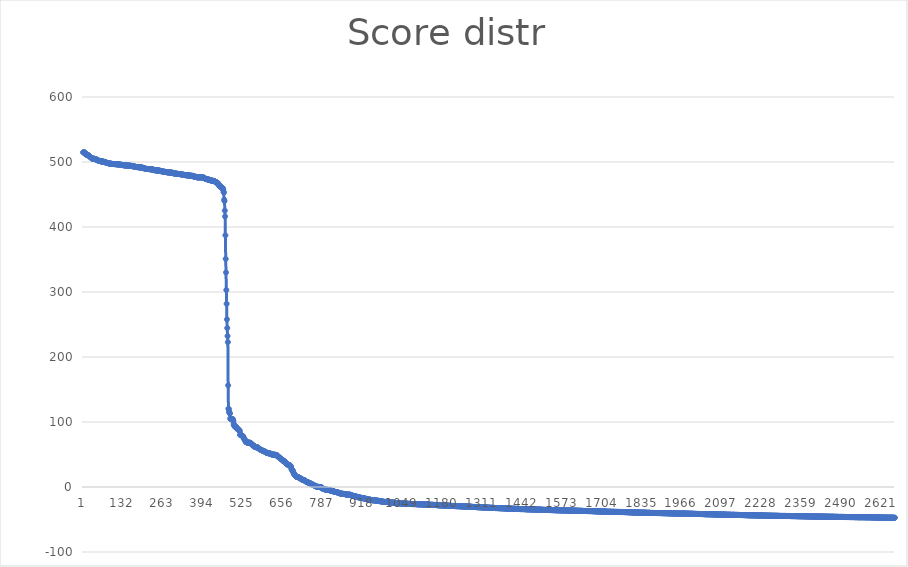
| Category | Series 0 |
|---|---|
| 0 | 514.8 |
| 1 | 514.8 |
| 2 | 514.8 |
| 3 | 514.7 |
| 4 | 514.7 |
| 5 | 514.7 |
| 6 | 512.7 |
| 7 | 512.7 |
| 8 | 512.7 |
| 9 | 512.7 |
| 10 | 512.7 |
| 11 | 511.2 |
| 12 | 510.8 |
| 13 | 510.6 |
| 14 | 510.6 |
| 15 | 510.6 |
| 16 | 510.6 |
| 17 | 510.6 |
| 18 | 510 |
| 19 | 509.2 |
| 20 | 509.1 |
| 21 | 508.8 |
| 22 | 508.6 |
| 23 | 507.6 |
| 24 | 507.4 |
| 25 | 506.9 |
| 26 | 506.4 |
| 27 | 506 |
| 28 | 505.8 |
| 29 | 505.6 |
| 30 | 505.2 |
| 31 | 505.2 |
| 32 | 505.2 |
| 33 | 505.2 |
| 34 | 505.1 |
| 35 | 505.1 |
| 36 | 505 |
| 37 | 504.5 |
| 38 | 504.5 |
| 39 | 504.5 |
| 40 | 504.5 |
| 41 | 504.4 |
| 42 | 504.3 |
| 43 | 503.9 |
| 44 | 503.6 |
| 45 | 503.3 |
| 46 | 502.8 |
| 47 | 502.8 |
| 48 | 502.8 |
| 49 | 502.2 |
| 50 | 502.1 |
| 51 | 502.1 |
| 52 | 502 |
| 53 | 501.7 |
| 54 | 501.5 |
| 55 | 501.5 |
| 56 | 501.5 |
| 57 | 501.1 |
| 58 | 501 |
| 59 | 501 |
| 60 | 500.9 |
| 61 | 500.9 |
| 62 | 500.8 |
| 63 | 500.7 |
| 64 | 500.6 |
| 65 | 500.6 |
| 66 | 500.4 |
| 67 | 500.4 |
| 68 | 500.4 |
| 69 | 500.1 |
| 70 | 499.9 |
| 71 | 499.9 |
| 72 | 499.5 |
| 73 | 499.5 |
| 74 | 499.4 |
| 75 | 499.3 |
| 76 | 499.1 |
| 77 | 498.8 |
| 78 | 498.6 |
| 79 | 498.4 |
| 80 | 498.4 |
| 81 | 498.3 |
| 82 | 498.3 |
| 83 | 498 |
| 84 | 497.9 |
| 85 | 497.8 |
| 86 | 497.8 |
| 87 | 497.4 |
| 88 | 497.4 |
| 89 | 497.3 |
| 90 | 497.3 |
| 91 | 497.3 |
| 92 | 497.3 |
| 93 | 497.2 |
| 94 | 497.2 |
| 95 | 497 |
| 96 | 496.9 |
| 97 | 496.9 |
| 98 | 496.9 |
| 99 | 496.9 |
| 100 | 496.9 |
| 101 | 496.9 |
| 102 | 496.9 |
| 103 | 496.8 |
| 104 | 496.7 |
| 105 | 496.7 |
| 106 | 496.7 |
| 107 | 496.7 |
| 108 | 496.6 |
| 109 | 496.5 |
| 110 | 496.5 |
| 111 | 496.5 |
| 112 | 496.4 |
| 113 | 496.4 |
| 114 | 496.4 |
| 115 | 496.4 |
| 116 | 496.4 |
| 117 | 496.4 |
| 118 | 496.3 |
| 119 | 496.2 |
| 120 | 496.1 |
| 121 | 495.9 |
| 122 | 495.8 |
| 123 | 495.8 |
| 124 | 495.8 |
| 125 | 495.6 |
| 126 | 495.6 |
| 127 | 495.6 |
| 128 | 495.4 |
| 129 | 495.3 |
| 130 | 495.2 |
| 131 | 495.1 |
| 132 | 495.1 |
| 133 | 495.1 |
| 134 | 495 |
| 135 | 494.9 |
| 136 | 494.8 |
| 137 | 494.8 |
| 138 | 494.8 |
| 139 | 494.7 |
| 140 | 494.7 |
| 141 | 494.7 |
| 142 | 494.6 |
| 143 | 494.6 |
| 144 | 494.6 |
| 145 | 494.5 |
| 146 | 494.5 |
| 147 | 494.5 |
| 148 | 494.4 |
| 149 | 494.4 |
| 150 | 494.3 |
| 151 | 494.3 |
| 152 | 494.2 |
| 153 | 494.2 |
| 154 | 494.2 |
| 155 | 494.2 |
| 156 | 494.2 |
| 157 | 494.1 |
| 158 | 494.1 |
| 159 | 493.7 |
| 160 | 493.7 |
| 161 | 493.6 |
| 162 | 493.5 |
| 163 | 493.5 |
| 164 | 493.4 |
| 165 | 493.4 |
| 166 | 493.3 |
| 167 | 493 |
| 168 | 492.8 |
| 169 | 492.8 |
| 170 | 492.7 |
| 171 | 492.6 |
| 172 | 492.6 |
| 173 | 492.5 |
| 174 | 492.3 |
| 175 | 492.3 |
| 176 | 492.3 |
| 177 | 492.2 |
| 178 | 492.1 |
| 179 | 492.1 |
| 180 | 492 |
| 181 | 492 |
| 182 | 492 |
| 183 | 492 |
| 184 | 491.8 |
| 185 | 491.8 |
| 186 | 491.7 |
| 187 | 491.6 |
| 188 | 491.6 |
| 189 | 491.5 |
| 190 | 491.5 |
| 191 | 491.4 |
| 192 | 491.4 |
| 193 | 491.3 |
| 194 | 491.2 |
| 195 | 491.2 |
| 196 | 491.1 |
| 197 | 490.8 |
| 198 | 490.6 |
| 199 | 490.4 |
| 200 | 490.3 |
| 201 | 490.2 |
| 202 | 490.1 |
| 203 | 489.9 |
| 204 | 489.6 |
| 205 | 489.6 |
| 206 | 489.6 |
| 207 | 489.3 |
| 208 | 489.2 |
| 209 | 489.2 |
| 210 | 489.2 |
| 211 | 489.2 |
| 212 | 489.2 |
| 213 | 489.2 |
| 214 | 489.2 |
| 215 | 489.1 |
| 216 | 489.1 |
| 217 | 489 |
| 218 | 488.9 |
| 219 | 488.9 |
| 220 | 488.9 |
| 221 | 488.9 |
| 222 | 488.9 |
| 223 | 488.8 |
| 224 | 488.5 |
| 225 | 488.5 |
| 226 | 488.5 |
| 227 | 488.5 |
| 228 | 488.4 |
| 229 | 488.3 |
| 230 | 488 |
| 231 | 487.9 |
| 232 | 487.9 |
| 233 | 487.9 |
| 234 | 487.5 |
| 235 | 487.3 |
| 236 | 487.2 |
| 237 | 487.2 |
| 238 | 487.2 |
| 239 | 487.2 |
| 240 | 487.1 |
| 241 | 487 |
| 242 | 486.9 |
| 243 | 486.9 |
| 244 | 486.9 |
| 245 | 486.9 |
| 246 | 486.9 |
| 247 | 486.9 |
| 248 | 486.8 |
| 249 | 486.8 |
| 250 | 486.8 |
| 251 | 486.6 |
| 252 | 486.4 |
| 253 | 486 |
| 254 | 486 |
| 255 | 486 |
| 256 | 485.9 |
| 257 | 485.9 |
| 258 | 485.9 |
| 259 | 485.7 |
| 260 | 485.4 |
| 261 | 485.4 |
| 262 | 485.2 |
| 263 | 485.1 |
| 264 | 485.1 |
| 265 | 485 |
| 266 | 484.9 |
| 267 | 484.8 |
| 268 | 484.8 |
| 269 | 484.8 |
| 270 | 484.8 |
| 271 | 484.5 |
| 272 | 484.5 |
| 273 | 484.5 |
| 274 | 484.5 |
| 275 | 484.5 |
| 276 | 484 |
| 277 | 484 |
| 278 | 483.9 |
| 279 | 483.9 |
| 280 | 483.9 |
| 281 | 483.9 |
| 282 | 483.9 |
| 283 | 483.9 |
| 284 | 483.9 |
| 285 | 483.8 |
| 286 | 483.7 |
| 287 | 483.7 |
| 288 | 483.7 |
| 289 | 483.7 |
| 290 | 483.6 |
| 291 | 483.5 |
| 292 | 483.3 |
| 293 | 483.2 |
| 294 | 482.8 |
| 295 | 482.8 |
| 296 | 482.7 |
| 297 | 482.7 |
| 298 | 482.6 |
| 299 | 482.3 |
| 300 | 482.3 |
| 301 | 482.3 |
| 302 | 482.3 |
| 303 | 482.1 |
| 304 | 482.1 |
| 305 | 482.1 |
| 306 | 482 |
| 307 | 482 |
| 308 | 481.8 |
| 309 | 481.6 |
| 310 | 481.6 |
| 311 | 481.6 |
| 312 | 481.5 |
| 313 | 481.5 |
| 314 | 481.5 |
| 315 | 481.5 |
| 316 | 481.5 |
| 317 | 481.4 |
| 318 | 481.3 |
| 319 | 481.3 |
| 320 | 481.1 |
| 321 | 481 |
| 322 | 481 |
| 323 | 480.7 |
| 324 | 480.7 |
| 325 | 480.6 |
| 326 | 480.5 |
| 327 | 480.5 |
| 328 | 480.5 |
| 329 | 480.5 |
| 330 | 480.1 |
| 331 | 480 |
| 332 | 480 |
| 333 | 480 |
| 334 | 479.8 |
| 335 | 479.8 |
| 336 | 479.8 |
| 337 | 479.7 |
| 338 | 479.5 |
| 339 | 479.5 |
| 340 | 479.5 |
| 341 | 479.5 |
| 342 | 479.5 |
| 343 | 479.5 |
| 344 | 479.5 |
| 345 | 479.5 |
| 346 | 479.5 |
| 347 | 479.5 |
| 348 | 479.2 |
| 349 | 479.1 |
| 350 | 479 |
| 351 | 478.9 |
| 352 | 478.8 |
| 353 | 478.8 |
| 354 | 478.8 |
| 355 | 478.7 |
| 356 | 478.7 |
| 357 | 478.7 |
| 358 | 478.7 |
| 359 | 478.7 |
| 360 | 478.6 |
| 361 | 477.9 |
| 362 | 477.8 |
| 363 | 477.8 |
| 364 | 477.5 |
| 365 | 477.4 |
| 366 | 477.2 |
| 367 | 477.2 |
| 368 | 477.2 |
| 369 | 477.2 |
| 370 | 477.2 |
| 371 | 477.1 |
| 372 | 477 |
| 373 | 476.4 |
| 374 | 476.4 |
| 375 | 476.4 |
| 376 | 476.4 |
| 377 | 476.4 |
| 378 | 476.4 |
| 379 | 476.4 |
| 380 | 476.4 |
| 381 | 476.4 |
| 382 | 476.4 |
| 383 | 476.4 |
| 384 | 476.4 |
| 385 | 476.4 |
| 386 | 476.4 |
| 387 | 476.4 |
| 388 | 476.4 |
| 389 | 476.4 |
| 390 | 476.1 |
| 391 | 476.1 |
| 392 | 476.1 |
| 393 | 476.1 |
| 394 | 475.9 |
| 395 | 475.9 |
| 396 | 475.7 |
| 397 | 475.7 |
| 398 | 475.2 |
| 399 | 474.5 |
| 400 | 474.4 |
| 401 | 474.1 |
| 402 | 473.7 |
| 403 | 473.7 |
| 404 | 473.6 |
| 405 | 473.6 |
| 406 | 473.6 |
| 407 | 473.5 |
| 408 | 473.5 |
| 409 | 473 |
| 410 | 473 |
| 411 | 472.7 |
| 412 | 472.6 |
| 413 | 472.6 |
| 414 | 472.6 |
| 415 | 472.5 |
| 416 | 472.1 |
| 417 | 472 |
| 418 | 471.6 |
| 419 | 471.5 |
| 420 | 471.4 |
| 421 | 471.4 |
| 422 | 471.2 |
| 423 | 471.2 |
| 424 | 471.1 |
| 425 | 471 |
| 426 | 471 |
| 427 | 470.9 |
| 428 | 470.9 |
| 429 | 470.6 |
| 430 | 470.4 |
| 431 | 470 |
| 432 | 469.9 |
| 433 | 469.4 |
| 434 | 469.4 |
| 435 | 469.1 |
| 436 | 468.7 |
| 437 | 468.5 |
| 438 | 468.4 |
| 439 | 468.1 |
| 440 | 467.8 |
| 441 | 467.8 |
| 442 | 466 |
| 443 | 465.7 |
| 444 | 465.3 |
| 445 | 464.9 |
| 446 | 463.3 |
| 447 | 462.5 |
| 448 | 462.5 |
| 449 | 462.5 |
| 450 | 462.3 |
| 451 | 462.2 |
| 452 | 462 |
| 453 | 461.1 |
| 454 | 460.2 |
| 455 | 460.1 |
| 456 | 459.9 |
| 457 | 459.9 |
| 458 | 459.3 |
| 459 | 457.1 |
| 460 | 453.8 |
| 461 | 453 |
| 462 | 442.1 |
| 463 | 439.8 |
| 464 | 425.2 |
| 465 | 416.2 |
| 466 | 387.2 |
| 467 | 350.9 |
| 468 | 330.1 |
| 469 | 303 |
| 470 | 281.9 |
| 471 | 257.9 |
| 472 | 244.6 |
| 473 | 232.2 |
| 474 | 222.9 |
| 475 | 156.4 |
| 476 | 120.6 |
| 477 | 120.1 |
| 478 | 116.5 |
| 479 | 114.1 |
| 480 | 113.8 |
| 481 | 112.9 |
| 482 | 105.2 |
| 483 | 104.7 |
| 484 | 104.6 |
| 485 | 104.6 |
| 486 | 104.6 |
| 487 | 104.6 |
| 488 | 104.6 |
| 489 | 104.6 |
| 490 | 104.6 |
| 491 | 102.6 |
| 492 | 101.3 |
| 493 | 97.4 |
| 494 | 94.9 |
| 495 | 94.9 |
| 496 | 94.9 |
| 497 | 92.7 |
| 498 | 92.4 |
| 499 | 92.4 |
| 500 | 92.2 |
| 501 | 92.2 |
| 502 | 92.2 |
| 503 | 91.3 |
| 504 | 90.1 |
| 505 | 90 |
| 506 | 88.6 |
| 507 | 88.6 |
| 508 | 88.6 |
| 509 | 88.2 |
| 510 | 87.5 |
| 511 | 87.2 |
| 512 | 87 |
| 513 | 86.2 |
| 514 | 80.2 |
| 515 | 80.2 |
| 516 | 80.2 |
| 517 | 80.2 |
| 518 | 80.1 |
| 519 | 79.8 |
| 520 | 79 |
| 521 | 78.6 |
| 522 | 78.4 |
| 523 | 78.2 |
| 524 | 77.9 |
| 525 | 77.3 |
| 526 | 74.6 |
| 527 | 74.5 |
| 528 | 74 |
| 529 | 72.8 |
| 530 | 72.4 |
| 531 | 72.1 |
| 532 | 70 |
| 533 | 69.3 |
| 534 | 69.3 |
| 535 | 68.8 |
| 536 | 68.7 |
| 537 | 68.3 |
| 538 | 68.3 |
| 539 | 68.2 |
| 540 | 68.2 |
| 541 | 68.2 |
| 542 | 68.2 |
| 543 | 68.2 |
| 544 | 68.2 |
| 545 | 68.2 |
| 546 | 68.2 |
| 547 | 67.8 |
| 548 | 67.4 |
| 549 | 67.4 |
| 550 | 66.7 |
| 551 | 66.6 |
| 552 | 66.6 |
| 553 | 65.5 |
| 554 | 64.7 |
| 555 | 64 |
| 556 | 64 |
| 557 | 64 |
| 558 | 64 |
| 559 | 63.2 |
| 560 | 62.5 |
| 561 | 62.4 |
| 562 | 62.3 |
| 563 | 61.4 |
| 564 | 61.3 |
| 565 | 61.3 |
| 566 | 61.3 |
| 567 | 61.3 |
| 568 | 61.1 |
| 569 | 60.8 |
| 570 | 60.8 |
| 571 | 60.8 |
| 572 | 60.7 |
| 573 | 60.4 |
| 574 | 60.4 |
| 575 | 59.5 |
| 576 | 58.7 |
| 577 | 58.7 |
| 578 | 58.7 |
| 579 | 58.3 |
| 580 | 57.3 |
| 581 | 57.3 |
| 582 | 57.2 |
| 583 | 57 |
| 584 | 56.8 |
| 585 | 56.7 |
| 586 | 56.3 |
| 587 | 56.1 |
| 588 | 55.9 |
| 589 | 55.5 |
| 590 | 55.4 |
| 591 | 55.4 |
| 592 | 55.1 |
| 593 | 55.1 |
| 594 | 54.4 |
| 595 | 54.3 |
| 596 | 54.2 |
| 597 | 54 |
| 598 | 53.8 |
| 599 | 53.3 |
| 600 | 52.7 |
| 601 | 52.7 |
| 602 | 52.6 |
| 603 | 52.5 |
| 604 | 52.4 |
| 605 | 52.1 |
| 606 | 52.1 |
| 607 | 52 |
| 608 | 51.9 |
| 609 | 51.9 |
| 610 | 51.6 |
| 611 | 51.3 |
| 612 | 51.2 |
| 613 | 51.2 |
| 614 | 51.2 |
| 615 | 51.2 |
| 616 | 50.7 |
| 617 | 50.3 |
| 618 | 50 |
| 619 | 49.9 |
| 620 | 49.9 |
| 621 | 49.9 |
| 622 | 49.8 |
| 623 | 49.7 |
| 624 | 49.7 |
| 625 | 49.7 |
| 626 | 49.7 |
| 627 | 49.7 |
| 628 | 49.6 |
| 629 | 49.6 |
| 630 | 49.2 |
| 631 | 49 |
| 632 | 48.7 |
| 633 | 48.7 |
| 634 | 48.7 |
| 635 | 48.7 |
| 636 | 48.7 |
| 637 | 47.4 |
| 638 | 46.6 |
| 639 | 46.5 |
| 640 | 46.3 |
| 641 | 46.3 |
| 642 | 45.6 |
| 643 | 45.3 |
| 644 | 44.5 |
| 645 | 44 |
| 646 | 43.9 |
| 647 | 43.8 |
| 648 | 43.2 |
| 649 | 42.4 |
| 650 | 42.4 |
| 651 | 42.4 |
| 652 | 42.2 |
| 653 | 41.8 |
| 654 | 41.6 |
| 655 | 39.9 |
| 656 | 39.9 |
| 657 | 39.8 |
| 658 | 39.6 |
| 659 | 39.6 |
| 660 | 39.2 |
| 661 | 38.8 |
| 662 | 38.5 |
| 663 | 37.2 |
| 664 | 36.6 |
| 665 | 36 |
| 666 | 35.7 |
| 667 | 35.6 |
| 668 | 35.2 |
| 669 | 34.5 |
| 670 | 34.5 |
| 671 | 34.3 |
| 672 | 34.2 |
| 673 | 34.2 |
| 674 | 34 |
| 675 | 34 |
| 676 | 33.5 |
| 677 | 33.4 |
| 678 | 33.1 |
| 679 | 32.3 |
| 680 | 31.8 |
| 681 | 31.6 |
| 682 | 27.8 |
| 683 | 27.5 |
| 684 | 26.1 |
| 685 | 26.1 |
| 686 | 26 |
| 687 | 24.4 |
| 688 | 23.3 |
| 689 | 21.8 |
| 690 | 21.3 |
| 691 | 19.9 |
| 692 | 19.6 |
| 693 | 18.5 |
| 694 | 18 |
| 695 | 17.8 |
| 696 | 17.3 |
| 697 | 16.3 |
| 698 | 15.8 |
| 699 | 15.8 |
| 700 | 15.6 |
| 701 | 15.5 |
| 702 | 15.4 |
| 703 | 15.1 |
| 704 | 15 |
| 705 | 15 |
| 706 | 15 |
| 707 | 14.6 |
| 708 | 14.2 |
| 709 | 14.1 |
| 710 | 13.7 |
| 711 | 13.2 |
| 712 | 13.2 |
| 713 | 13.2 |
| 714 | 12.3 |
| 715 | 11.9 |
| 716 | 11.8 |
| 717 | 11.5 |
| 718 | 11.3 |
| 719 | 11.1 |
| 720 | 11 |
| 721 | 11 |
| 722 | 11 |
| 723 | 10.2 |
| 724 | 10.2 |
| 725 | 10.1 |
| 726 | 10 |
| 727 | 9.9 |
| 728 | 9.7 |
| 729 | 8.6 |
| 730 | 8.3 |
| 731 | 7.9 |
| 732 | 7.7 |
| 733 | 7.6 |
| 734 | 7.3 |
| 735 | 7.3 |
| 736 | 7.1 |
| 737 | 6.8 |
| 738 | 6.7 |
| 739 | 6.7 |
| 740 | 6.5 |
| 741 | 6.1 |
| 742 | 5.5 |
| 743 | 5.5 |
| 744 | 5.5 |
| 745 | 5.2 |
| 746 | 5.1 |
| 747 | 5.1 |
| 748 | 4.8 |
| 749 | 4.3 |
| 750 | 4 |
| 751 | 3.7 |
| 752 | 3.5 |
| 753 | 3.3 |
| 754 | 3.3 |
| 755 | 2.9 |
| 756 | 2.6 |
| 757 | 2.4 |
| 758 | 2.3 |
| 759 | 1.8 |
| 760 | 1.6 |
| 761 | 1.5 |
| 762 | 1.1 |
| 763 | 1.1 |
| 764 | 0.6 |
| 765 | 0.6 |
| 766 | 0.3 |
| 767 | 0.3 |
| 768 | 0.3 |
| 769 | 0.2 |
| 770 | 0.2 |
| 771 | 0.2 |
| 772 | 0.1 |
| 773 | 0 |
| 774 | -0.2 |
| 775 | -0.2 |
| 776 | -0.2 |
| 777 | -0.2 |
| 778 | -0.2 |
| 779 | -0.2 |
| 780 | -0.4 |
| 781 | -1 |
| 782 | -1 |
| 783 | -1.9 |
| 784 | -2.6 |
| 785 | -2.6 |
| 786 | -2.7 |
| 787 | -2.8 |
| 788 | -2.9 |
| 789 | -3.1 |
| 790 | -3.3 |
| 791 | -3.6 |
| 792 | -3.7 |
| 793 | -3.8 |
| 794 | -3.8 |
| 795 | -3.9 |
| 796 | -4.2 |
| 797 | -4.2 |
| 798 | -4.3 |
| 799 | -4.3 |
| 800 | -4.4 |
| 801 | -4.4 |
| 802 | -4.5 |
| 803 | -4.5 |
| 804 | -4.6 |
| 805 | -4.7 |
| 806 | -4.8 |
| 807 | -4.9 |
| 808 | -4.9 |
| 809 | -5.3 |
| 810 | -5.6 |
| 811 | -5.7 |
| 812 | -5.7 |
| 813 | -5.7 |
| 814 | -5.7 |
| 815 | -5.7 |
| 816 | -6 |
| 817 | -6.2 |
| 818 | -6.4 |
| 819 | -6.5 |
| 820 | -6.7 |
| 821 | -7 |
| 822 | -7.1 |
| 823 | -7.3 |
| 824 | -7.3 |
| 825 | -7.5 |
| 826 | -7.6 |
| 827 | -7.7 |
| 828 | -7.7 |
| 829 | -7.7 |
| 830 | -8 |
| 831 | -8.2 |
| 832 | -8.2 |
| 833 | -8.2 |
| 834 | -8.3 |
| 835 | -8.6 |
| 836 | -8.7 |
| 837 | -8.8 |
| 838 | -9.1 |
| 839 | -9.4 |
| 840 | -9.5 |
| 841 | -9.6 |
| 842 | -10 |
| 843 | -10.1 |
| 844 | -10.2 |
| 845 | -10.2 |
| 846 | -10.2 |
| 847 | -10.3 |
| 848 | -10.3 |
| 849 | -10.6 |
| 850 | -10.6 |
| 851 | -10.6 |
| 852 | -10.6 |
| 853 | -10.6 |
| 854 | -10.6 |
| 855 | -10.7 |
| 856 | -10.7 |
| 857 | -10.9 |
| 858 | -11.1 |
| 859 | -11.1 |
| 860 | -11.2 |
| 861 | -11.4 |
| 862 | -11.5 |
| 863 | -11.5 |
| 864 | -11.6 |
| 865 | -11.7 |
| 866 | -11.7 |
| 867 | -11.7 |
| 868 | -11.7 |
| 869 | -11.7 |
| 870 | -11.8 |
| 871 | -11.8 |
| 872 | -11.9 |
| 873 | -11.9 |
| 874 | -11.9 |
| 875 | -12 |
| 876 | -12 |
| 877 | -12.6 |
| 878 | -12.9 |
| 879 | -12.9 |
| 880 | -13.1 |
| 881 | -13.2 |
| 882 | -13.3 |
| 883 | -13.4 |
| 884 | -13.6 |
| 885 | -13.6 |
| 886 | -13.8 |
| 887 | -13.8 |
| 888 | -14 |
| 889 | -14.3 |
| 890 | -14.3 |
| 891 | -14.4 |
| 892 | -14.6 |
| 893 | -14.6 |
| 894 | -14.7 |
| 895 | -14.8 |
| 896 | -14.9 |
| 897 | -15.1 |
| 898 | -15.4 |
| 899 | -15.5 |
| 900 | -15.6 |
| 901 | -15.7 |
| 902 | -15.8 |
| 903 | -15.9 |
| 904 | -16 |
| 905 | -16 |
| 906 | -16.3 |
| 907 | -16.4 |
| 908 | -16.5 |
| 909 | -16.5 |
| 910 | -16.7 |
| 911 | -16.8 |
| 912 | -16.8 |
| 913 | -16.9 |
| 914 | -17 |
| 915 | -17.1 |
| 916 | -17.1 |
| 917 | -17.3 |
| 918 | -17.4 |
| 919 | -17.4 |
| 920 | -17.5 |
| 921 | -17.5 |
| 922 | -17.7 |
| 923 | -17.8 |
| 924 | -17.8 |
| 925 | -17.9 |
| 926 | -18.3 |
| 927 | -18.5 |
| 928 | -18.5 |
| 929 | -18.7 |
| 930 | -18.9 |
| 931 | -19 |
| 932 | -19.2 |
| 933 | -19.2 |
| 934 | -19.3 |
| 935 | -19.3 |
| 936 | -19.4 |
| 937 | -19.4 |
| 938 | -19.4 |
| 939 | -19.5 |
| 940 | -19.5 |
| 941 | -19.7 |
| 942 | -19.8 |
| 943 | -19.9 |
| 944 | -19.9 |
| 945 | -20 |
| 946 | -20.1 |
| 947 | -20.2 |
| 948 | -20.3 |
| 949 | -20.4 |
| 950 | -20.4 |
| 951 | -20.5 |
| 952 | -20.5 |
| 953 | -20.6 |
| 954 | -20.6 |
| 955 | -20.6 |
| 956 | -20.7 |
| 957 | -20.8 |
| 958 | -20.9 |
| 959 | -21 |
| 960 | -21 |
| 961 | -21 |
| 962 | -21 |
| 963 | -21 |
| 964 | -21 |
| 965 | -21.2 |
| 966 | -21.3 |
| 967 | -21.3 |
| 968 | -21.4 |
| 969 | -21.5 |
| 970 | -21.7 |
| 971 | -21.7 |
| 972 | -21.9 |
| 973 | -21.9 |
| 974 | -21.9 |
| 975 | -21.9 |
| 976 | -22 |
| 977 | -22 |
| 978 | -22.1 |
| 979 | -22.2 |
| 980 | -22.3 |
| 981 | -22.4 |
| 982 | -22.8 |
| 983 | -22.8 |
| 984 | -22.9 |
| 985 | -22.9 |
| 986 | -22.9 |
| 987 | -22.9 |
| 988 | -22.9 |
| 989 | -23 |
| 990 | -23 |
| 991 | -23 |
| 992 | -23 |
| 993 | -23.1 |
| 994 | -23.1 |
| 995 | -23.1 |
| 996 | -23.1 |
| 997 | -23.2 |
| 998 | -23.2 |
| 999 | -23.4 |
| 1000 | -23.4 |
| 1001 | -23.5 |
| 1002 | -23.5 |
| 1003 | -23.6 |
| 1004 | -23.6 |
| 1005 | -23.6 |
| 1006 | -23.6 |
| 1007 | -23.7 |
| 1008 | -23.7 |
| 1009 | -23.8 |
| 1010 | -23.9 |
| 1011 | -23.9 |
| 1012 | -24 |
| 1013 | -24 |
| 1014 | -24 |
| 1015 | -24 |
| 1016 | -24.1 |
| 1017 | -24.1 |
| 1018 | -24.1 |
| 1019 | -24.4 |
| 1020 | -24.5 |
| 1021 | -24.5 |
| 1022 | -24.5 |
| 1023 | -24.6 |
| 1024 | -24.7 |
| 1025 | -24.7 |
| 1026 | -24.8 |
| 1027 | -24.8 |
| 1028 | -24.9 |
| 1029 | -24.9 |
| 1030 | -25 |
| 1031 | -25 |
| 1032 | -25 |
| 1033 | -25 |
| 1034 | -25 |
| 1035 | -25.1 |
| 1036 | -25.1 |
| 1037 | -25.1 |
| 1038 | -25.1 |
| 1039 | -25.2 |
| 1040 | -25.2 |
| 1041 | -25.3 |
| 1042 | -25.3 |
| 1043 | -25.3 |
| 1044 | -25.4 |
| 1045 | -25.4 |
| 1046 | -25.4 |
| 1047 | -25.4 |
| 1048 | -25.5 |
| 1049 | -25.5 |
| 1050 | -25.5 |
| 1051 | -25.5 |
| 1052 | -25.6 |
| 1053 | -25.6 |
| 1054 | -25.6 |
| 1055 | -25.6 |
| 1056 | -25.6 |
| 1057 | -25.7 |
| 1058 | -25.7 |
| 1059 | -25.7 |
| 1060 | -25.7 |
| 1061 | -25.8 |
| 1062 | -25.8 |
| 1063 | -25.8 |
| 1064 | -25.8 |
| 1065 | -25.9 |
| 1066 | -25.9 |
| 1067 | -26 |
| 1068 | -26 |
| 1069 | -26 |
| 1070 | -26.1 |
| 1071 | -26.1 |
| 1072 | -26.1 |
| 1073 | -26.1 |
| 1074 | -26.1 |
| 1075 | -26.2 |
| 1076 | -26.2 |
| 1077 | -26.2 |
| 1078 | -26.2 |
| 1079 | -26.2 |
| 1080 | -26.2 |
| 1081 | -26.3 |
| 1082 | -26.3 |
| 1083 | -26.3 |
| 1084 | -26.3 |
| 1085 | -26.3 |
| 1086 | -26.3 |
| 1087 | -26.3 |
| 1088 | -26.3 |
| 1089 | -26.4 |
| 1090 | -26.4 |
| 1091 | -26.4 |
| 1092 | -26.5 |
| 1093 | -26.5 |
| 1094 | -26.5 |
| 1095 | -26.5 |
| 1096 | -26.5 |
| 1097 | -26.6 |
| 1098 | -26.6 |
| 1099 | -26.6 |
| 1100 | -26.6 |
| 1101 | -26.7 |
| 1102 | -26.7 |
| 1103 | -26.7 |
| 1104 | -26.7 |
| 1105 | -26.7 |
| 1106 | -26.7 |
| 1107 | -26.7 |
| 1108 | -26.7 |
| 1109 | -26.7 |
| 1110 | -26.7 |
| 1111 | -26.7 |
| 1112 | -26.7 |
| 1113 | -26.7 |
| 1114 | -26.8 |
| 1115 | -26.9 |
| 1116 | -26.9 |
| 1117 | -26.9 |
| 1118 | -26.9 |
| 1119 | -26.9 |
| 1120 | -26.9 |
| 1121 | -26.9 |
| 1122 | -26.9 |
| 1123 | -26.9 |
| 1124 | -26.9 |
| 1125 | -27 |
| 1126 | -27 |
| 1127 | -27 |
| 1128 | -27 |
| 1129 | -27 |
| 1130 | -27 |
| 1131 | -27 |
| 1132 | -27.1 |
| 1133 | -27.2 |
| 1134 | -27.3 |
| 1135 | -27.3 |
| 1136 | -27.4 |
| 1137 | -27.4 |
| 1138 | -27.4 |
| 1139 | -27.4 |
| 1140 | -27.4 |
| 1141 | -27.4 |
| 1142 | -27.4 |
| 1143 | -27.4 |
| 1144 | -27.4 |
| 1145 | -27.5 |
| 1146 | -27.5 |
| 1147 | -27.5 |
| 1148 | -27.5 |
| 1149 | -27.5 |
| 1150 | -27.6 |
| 1151 | -27.6 |
| 1152 | -27.6 |
| 1153 | -27.6 |
| 1154 | -27.7 |
| 1155 | -27.7 |
| 1156 | -27.7 |
| 1157 | -27.7 |
| 1158 | -27.8 |
| 1159 | -27.9 |
| 1160 | -27.9 |
| 1161 | -28 |
| 1162 | -28 |
| 1163 | -28 |
| 1164 | -28.1 |
| 1165 | -28.1 |
| 1166 | -28.1 |
| 1167 | -28.1 |
| 1168 | -28.2 |
| 1169 | -28.2 |
| 1170 | -28.2 |
| 1171 | -28.2 |
| 1172 | -28.2 |
| 1173 | -28.2 |
| 1174 | -28.2 |
| 1175 | -28.3 |
| 1176 | -28.3 |
| 1177 | -28.4 |
| 1178 | -28.4 |
| 1179 | -28.4 |
| 1180 | -28.4 |
| 1181 | -28.4 |
| 1182 | -28.4 |
| 1183 | -28.4 |
| 1184 | -28.5 |
| 1185 | -28.5 |
| 1186 | -28.5 |
| 1187 | -28.5 |
| 1188 | -28.5 |
| 1189 | -28.5 |
| 1190 | -28.5 |
| 1191 | -28.6 |
| 1192 | -28.7 |
| 1193 | -28.7 |
| 1194 | -28.7 |
| 1195 | -28.7 |
| 1196 | -28.8 |
| 1197 | -28.8 |
| 1198 | -28.9 |
| 1199 | -28.9 |
| 1200 | -28.9 |
| 1201 | -29 |
| 1202 | -29 |
| 1203 | -29 |
| 1204 | -29 |
| 1205 | -29 |
| 1206 | -29 |
| 1207 | -29.1 |
| 1208 | -29.1 |
| 1209 | -29.1 |
| 1210 | -29.1 |
| 1211 | -29.1 |
| 1212 | -29.2 |
| 1213 | -29.2 |
| 1214 | -29.2 |
| 1215 | -29.3 |
| 1216 | -29.3 |
| 1217 | -29.4 |
| 1218 | -29.4 |
| 1219 | -29.4 |
| 1220 | -29.4 |
| 1221 | -29.4 |
| 1222 | -29.4 |
| 1223 | -29.5 |
| 1224 | -29.5 |
| 1225 | -29.5 |
| 1226 | -29.5 |
| 1227 | -29.5 |
| 1228 | -29.5 |
| 1229 | -29.5 |
| 1230 | -29.6 |
| 1231 | -29.6 |
| 1232 | -29.6 |
| 1233 | -29.6 |
| 1234 | -29.6 |
| 1235 | -29.6 |
| 1236 | -29.7 |
| 1237 | -29.7 |
| 1238 | -29.7 |
| 1239 | -29.7 |
| 1240 | -29.8 |
| 1241 | -29.8 |
| 1242 | -29.8 |
| 1243 | -29.8 |
| 1244 | -29.8 |
| 1245 | -29.9 |
| 1246 | -29.9 |
| 1247 | -29.9 |
| 1248 | -29.9 |
| 1249 | -29.9 |
| 1250 | -30 |
| 1251 | -30 |
| 1252 | -30 |
| 1253 | -30 |
| 1254 | -30.1 |
| 1255 | -30.1 |
| 1256 | -30.1 |
| 1257 | -30.1 |
| 1258 | -30.1 |
| 1259 | -30.2 |
| 1260 | -30.2 |
| 1261 | -30.2 |
| 1262 | -30.2 |
| 1263 | -30.3 |
| 1264 | -30.3 |
| 1265 | -30.3 |
| 1266 | -30.3 |
| 1267 | -30.3 |
| 1268 | -30.3 |
| 1269 | -30.3 |
| 1270 | -30.4 |
| 1271 | -30.4 |
| 1272 | -30.5 |
| 1273 | -30.5 |
| 1274 | -30.6 |
| 1275 | -30.6 |
| 1276 | -30.6 |
| 1277 | -30.6 |
| 1278 | -30.7 |
| 1279 | -30.7 |
| 1280 | -30.7 |
| 1281 | -30.7 |
| 1282 | -30.7 |
| 1283 | -30.7 |
| 1284 | -30.8 |
| 1285 | -30.8 |
| 1286 | -30.8 |
| 1287 | -30.9 |
| 1288 | -30.9 |
| 1289 | -31 |
| 1290 | -31 |
| 1291 | -31 |
| 1292 | -31 |
| 1293 | -31.1 |
| 1294 | -31.1 |
| 1295 | -31.1 |
| 1296 | -31.1 |
| 1297 | -31.1 |
| 1298 | -31.1 |
| 1299 | -31.1 |
| 1300 | -31.1 |
| 1301 | -31.2 |
| 1302 | -31.2 |
| 1303 | -31.2 |
| 1304 | -31.3 |
| 1305 | -31.3 |
| 1306 | -31.3 |
| 1307 | -31.3 |
| 1308 | -31.3 |
| 1309 | -31.3 |
| 1310 | -31.4 |
| 1311 | -31.4 |
| 1312 | -31.4 |
| 1313 | -31.4 |
| 1314 | -31.4 |
| 1315 | -31.5 |
| 1316 | -31.5 |
| 1317 | -31.5 |
| 1318 | -31.5 |
| 1319 | -31.6 |
| 1320 | -31.6 |
| 1321 | -31.6 |
| 1322 | -31.6 |
| 1323 | -31.6 |
| 1324 | -31.7 |
| 1325 | -31.8 |
| 1326 | -31.8 |
| 1327 | -31.8 |
| 1328 | -31.8 |
| 1329 | -31.9 |
| 1330 | -31.9 |
| 1331 | -31.9 |
| 1332 | -31.9 |
| 1333 | -32 |
| 1334 | -32 |
| 1335 | -32 |
| 1336 | -32 |
| 1337 | -32 |
| 1338 | -32.1 |
| 1339 | -32.1 |
| 1340 | -32.1 |
| 1341 | -32.1 |
| 1342 | -32.1 |
| 1343 | -32.1 |
| 1344 | -32.1 |
| 1345 | -32.1 |
| 1346 | -32.2 |
| 1347 | -32.2 |
| 1348 | -32.3 |
| 1349 | -32.4 |
| 1350 | -32.4 |
| 1351 | -32.4 |
| 1352 | -32.4 |
| 1353 | -32.4 |
| 1354 | -32.4 |
| 1355 | -32.4 |
| 1356 | -32.5 |
| 1357 | -32.5 |
| 1358 | -32.5 |
| 1359 | -32.5 |
| 1360 | -32.5 |
| 1361 | -32.5 |
| 1362 | -32.6 |
| 1363 | -32.6 |
| 1364 | -32.6 |
| 1365 | -32.6 |
| 1366 | -32.6 |
| 1367 | -32.6 |
| 1368 | -32.7 |
| 1369 | -32.7 |
| 1370 | -32.7 |
| 1371 | -32.7 |
| 1372 | -32.7 |
| 1373 | -32.7 |
| 1374 | -32.7 |
| 1375 | -32.7 |
| 1376 | -32.8 |
| 1377 | -32.8 |
| 1378 | -32.8 |
| 1379 | -32.8 |
| 1380 | -32.9 |
| 1381 | -32.9 |
| 1382 | -32.9 |
| 1383 | -32.9 |
| 1384 | -32.9 |
| 1385 | -33 |
| 1386 | -33 |
| 1387 | -33 |
| 1388 | -33.1 |
| 1389 | -33.1 |
| 1390 | -33.1 |
| 1391 | -33.1 |
| 1392 | -33.1 |
| 1393 | -33.2 |
| 1394 | -33.2 |
| 1395 | -33.2 |
| 1396 | -33.2 |
| 1397 | -33.2 |
| 1398 | -33.3 |
| 1399 | -33.3 |
| 1400 | -33.4 |
| 1401 | -33.4 |
| 1402 | -33.4 |
| 1403 | -33.4 |
| 1404 | -33.4 |
| 1405 | -33.4 |
| 1406 | -33.4 |
| 1407 | -33.4 |
| 1408 | -33.5 |
| 1409 | -33.5 |
| 1410 | -33.5 |
| 1411 | -33.5 |
| 1412 | -33.5 |
| 1413 | -33.5 |
| 1414 | -33.5 |
| 1415 | -33.6 |
| 1416 | -33.6 |
| 1417 | -33.6 |
| 1418 | -33.6 |
| 1419 | -33.7 |
| 1420 | -33.7 |
| 1421 | -33.8 |
| 1422 | -33.8 |
| 1423 | -33.8 |
| 1424 | -33.8 |
| 1425 | -33.8 |
| 1426 | -33.8 |
| 1427 | -33.9 |
| 1428 | -33.9 |
| 1429 | -33.9 |
| 1430 | -33.9 |
| 1431 | -33.9 |
| 1432 | -34 |
| 1433 | -34 |
| 1434 | -34 |
| 1435 | -34 |
| 1436 | -34 |
| 1437 | -34 |
| 1438 | -34 |
| 1439 | -34 |
| 1440 | -34 |
| 1441 | -34 |
| 1442 | -34 |
| 1443 | -34 |
| 1444 | -34.1 |
| 1445 | -34.1 |
| 1446 | -34.1 |
| 1447 | -34.1 |
| 1448 | -34.1 |
| 1449 | -34.2 |
| 1450 | -34.2 |
| 1451 | -34.2 |
| 1452 | -34.2 |
| 1453 | -34.2 |
| 1454 | -34.3 |
| 1455 | -34.3 |
| 1456 | -34.3 |
| 1457 | -34.3 |
| 1458 | -34.3 |
| 1459 | -34.3 |
| 1460 | -34.3 |
| 1461 | -34.3 |
| 1462 | -34.3 |
| 1463 | -34.3 |
| 1464 | -34.4 |
| 1465 | -34.4 |
| 1466 | -34.4 |
| 1467 | -34.4 |
| 1468 | -34.4 |
| 1469 | -34.5 |
| 1470 | -34.5 |
| 1471 | -34.5 |
| 1472 | -34.5 |
| 1473 | -34.5 |
| 1474 | -34.5 |
| 1475 | -34.5 |
| 1476 | -34.5 |
| 1477 | -34.5 |
| 1478 | -34.6 |
| 1479 | -34.6 |
| 1480 | -34.6 |
| 1481 | -34.6 |
| 1482 | -34.6 |
| 1483 | -34.6 |
| 1484 | -34.6 |
| 1485 | -34.7 |
| 1486 | -34.7 |
| 1487 | -34.7 |
| 1488 | -34.7 |
| 1489 | -34.8 |
| 1490 | -34.8 |
| 1491 | -34.8 |
| 1492 | -34.8 |
| 1493 | -34.8 |
| 1494 | -34.8 |
| 1495 | -34.8 |
| 1496 | -34.8 |
| 1497 | -34.8 |
| 1498 | -34.8 |
| 1499 | -34.9 |
| 1500 | -34.9 |
| 1501 | -35 |
| 1502 | -35 |
| 1503 | -35 |
| 1504 | -35.1 |
| 1505 | -35.1 |
| 1506 | -35.1 |
| 1507 | -35.1 |
| 1508 | -35.1 |
| 1509 | -35.1 |
| 1510 | -35.2 |
| 1511 | -35.2 |
| 1512 | -35.2 |
| 1513 | -35.2 |
| 1514 | -35.2 |
| 1515 | -35.2 |
| 1516 | -35.2 |
| 1517 | -35.2 |
| 1518 | -35.3 |
| 1519 | -35.3 |
| 1520 | -35.3 |
| 1521 | -35.3 |
| 1522 | -35.3 |
| 1523 | -35.3 |
| 1524 | -35.3 |
| 1525 | -35.4 |
| 1526 | -35.4 |
| 1527 | -35.4 |
| 1528 | -35.4 |
| 1529 | -35.5 |
| 1530 | -35.5 |
| 1531 | -35.5 |
| 1532 | -35.5 |
| 1533 | -35.5 |
| 1534 | -35.5 |
| 1535 | -35.5 |
| 1536 | -35.5 |
| 1537 | -35.6 |
| 1538 | -35.6 |
| 1539 | -35.6 |
| 1540 | -35.6 |
| 1541 | -35.6 |
| 1542 | -35.6 |
| 1543 | -35.6 |
| 1544 | -35.7 |
| 1545 | -35.7 |
| 1546 | -35.7 |
| 1547 | -35.7 |
| 1548 | -35.7 |
| 1549 | -35.7 |
| 1550 | -35.7 |
| 1551 | -35.7 |
| 1552 | -35.8 |
| 1553 | -35.8 |
| 1554 | -35.8 |
| 1555 | -35.8 |
| 1556 | -35.8 |
| 1557 | -35.8 |
| 1558 | -35.8 |
| 1559 | -35.8 |
| 1560 | -35.9 |
| 1561 | -35.9 |
| 1562 | -35.9 |
| 1563 | -35.9 |
| 1564 | -35.9 |
| 1565 | -35.9 |
| 1566 | -35.9 |
| 1567 | -35.9 |
| 1568 | -35.9 |
| 1569 | -35.9 |
| 1570 | -36 |
| 1571 | -36 |
| 1572 | -36 |
| 1573 | -36 |
| 1574 | -36 |
| 1575 | -36 |
| 1576 | -36 |
| 1577 | -36 |
| 1578 | -36 |
| 1579 | -36 |
| 1580 | -36 |
| 1581 | -36.1 |
| 1582 | -36.1 |
| 1583 | -36.1 |
| 1584 | -36.1 |
| 1585 | -36.1 |
| 1586 | -36.1 |
| 1587 | -36.1 |
| 1588 | -36.1 |
| 1589 | -36.2 |
| 1590 | -36.2 |
| 1591 | -36.2 |
| 1592 | -36.2 |
| 1593 | -36.2 |
| 1594 | -36.2 |
| 1595 | -36.2 |
| 1596 | -36.2 |
| 1597 | -36.2 |
| 1598 | -36.2 |
| 1599 | -36.2 |
| 1600 | -36.3 |
| 1601 | -36.3 |
| 1602 | -36.3 |
| 1603 | -36.3 |
| 1604 | -36.4 |
| 1605 | -36.4 |
| 1606 | -36.4 |
| 1607 | -36.4 |
| 1608 | -36.4 |
| 1609 | -36.4 |
| 1610 | -36.4 |
| 1611 | -36.4 |
| 1612 | -36.5 |
| 1613 | -36.5 |
| 1614 | -36.5 |
| 1615 | -36.5 |
| 1616 | -36.5 |
| 1617 | -36.5 |
| 1618 | -36.5 |
| 1619 | -36.5 |
| 1620 | -36.6 |
| 1621 | -36.6 |
| 1622 | -36.6 |
| 1623 | -36.6 |
| 1624 | -36.6 |
| 1625 | -36.6 |
| 1626 | -36.6 |
| 1627 | -36.6 |
| 1628 | -36.6 |
| 1629 | -36.6 |
| 1630 | -36.7 |
| 1631 | -36.7 |
| 1632 | -36.7 |
| 1633 | -36.7 |
| 1634 | -36.7 |
| 1635 | -36.7 |
| 1636 | -36.7 |
| 1637 | -36.8 |
| 1638 | -36.8 |
| 1639 | -36.9 |
| 1640 | -36.9 |
| 1641 | -36.9 |
| 1642 | -36.9 |
| 1643 | -36.9 |
| 1644 | -36.9 |
| 1645 | -36.9 |
| 1646 | -36.9 |
| 1647 | -36.9 |
| 1648 | -36.9 |
| 1649 | -37 |
| 1650 | -37 |
| 1651 | -37 |
| 1652 | -37 |
| 1653 | -37 |
| 1654 | -37 |
| 1655 | -37 |
| 1656 | -37 |
| 1657 | -37.1 |
| 1658 | -37.1 |
| 1659 | -37.1 |
| 1660 | -37.1 |
| 1661 | -37.1 |
| 1662 | -37.1 |
| 1663 | -37.1 |
| 1664 | -37.1 |
| 1665 | -37.1 |
| 1666 | -37.1 |
| 1667 | -37.2 |
| 1668 | -37.2 |
| 1669 | -37.2 |
| 1670 | -37.2 |
| 1671 | -37.2 |
| 1672 | -37.2 |
| 1673 | -37.3 |
| 1674 | -37.3 |
| 1675 | -37.3 |
| 1676 | -37.3 |
| 1677 | -37.3 |
| 1678 | -37.4 |
| 1679 | -37.4 |
| 1680 | -37.4 |
| 1681 | -37.4 |
| 1682 | -37.4 |
| 1683 | -37.4 |
| 1684 | -37.5 |
| 1685 | -37.5 |
| 1686 | -37.5 |
| 1687 | -37.5 |
| 1688 | -37.5 |
| 1689 | -37.5 |
| 1690 | -37.5 |
| 1691 | -37.5 |
| 1692 | -37.5 |
| 1693 | -37.6 |
| 1694 | -37.6 |
| 1695 | -37.6 |
| 1696 | -37.6 |
| 1697 | -37.7 |
| 1698 | -37.7 |
| 1699 | -37.7 |
| 1700 | -37.7 |
| 1701 | -37.7 |
| 1702 | -37.7 |
| 1703 | -37.7 |
| 1704 | -37.8 |
| 1705 | -37.8 |
| 1706 | -37.8 |
| 1707 | -37.8 |
| 1708 | -37.8 |
| 1709 | -37.8 |
| 1710 | -37.8 |
| 1711 | -37.8 |
| 1712 | -37.8 |
| 1713 | -37.9 |
| 1714 | -38 |
| 1715 | -38.1 |
| 1716 | -38.1 |
| 1717 | -38.1 |
| 1718 | -38.1 |
| 1719 | -38.1 |
| 1720 | -38.1 |
| 1721 | -38.1 |
| 1722 | -38.1 |
| 1723 | -38.1 |
| 1724 | -38.1 |
| 1725 | -38.1 |
| 1726 | -38.1 |
| 1727 | -38.1 |
| 1728 | -38.1 |
| 1729 | -38.2 |
| 1730 | -38.2 |
| 1731 | -38.2 |
| 1732 | -38.2 |
| 1733 | -38.2 |
| 1734 | -38.2 |
| 1735 | -38.2 |
| 1736 | -38.2 |
| 1737 | -38.2 |
| 1738 | -38.2 |
| 1739 | -38.2 |
| 1740 | -38.2 |
| 1741 | -38.3 |
| 1742 | -38.3 |
| 1743 | -38.3 |
| 1744 | -38.3 |
| 1745 | -38.3 |
| 1746 | -38.3 |
| 1747 | -38.3 |
| 1748 | -38.3 |
| 1749 | -38.3 |
| 1750 | -38.3 |
| 1751 | -38.3 |
| 1752 | -38.3 |
| 1753 | -38.4 |
| 1754 | -38.4 |
| 1755 | -38.4 |
| 1756 | -38.4 |
| 1757 | -38.4 |
| 1758 | -38.5 |
| 1759 | -38.5 |
| 1760 | -38.5 |
| 1761 | -38.5 |
| 1762 | -38.5 |
| 1763 | -38.5 |
| 1764 | -38.5 |
| 1765 | -38.5 |
| 1766 | -38.5 |
| 1767 | -38.5 |
| 1768 | -38.5 |
| 1769 | -38.5 |
| 1770 | -38.6 |
| 1771 | -38.6 |
| 1772 | -38.6 |
| 1773 | -38.6 |
| 1774 | -38.6 |
| 1775 | -38.6 |
| 1776 | -38.7 |
| 1777 | -38.7 |
| 1778 | -38.7 |
| 1779 | -38.7 |
| 1780 | -38.7 |
| 1781 | -38.7 |
| 1782 | -38.7 |
| 1783 | -38.8 |
| 1784 | -38.8 |
| 1785 | -38.8 |
| 1786 | -38.8 |
| 1787 | -38.8 |
| 1788 | -38.8 |
| 1789 | -38.8 |
| 1790 | -38.9 |
| 1791 | -38.9 |
| 1792 | -38.9 |
| 1793 | -38.9 |
| 1794 | -39 |
| 1795 | -39 |
| 1796 | -39 |
| 1797 | -39 |
| 1798 | -39 |
| 1799 | -39 |
| 1800 | -39.1 |
| 1801 | -39.1 |
| 1802 | -39.1 |
| 1803 | -39.1 |
| 1804 | -39.1 |
| 1805 | -39.1 |
| 1806 | -39.2 |
| 1807 | -39.2 |
| 1808 | -39.2 |
| 1809 | -39.2 |
| 1810 | -39.2 |
| 1811 | -39.2 |
| 1812 | -39.2 |
| 1813 | -39.2 |
| 1814 | -39.2 |
| 1815 | -39.2 |
| 1816 | -39.3 |
| 1817 | -39.3 |
| 1818 | -39.3 |
| 1819 | -39.3 |
| 1820 | -39.3 |
| 1821 | -39.3 |
| 1822 | -39.3 |
| 1823 | -39.4 |
| 1824 | -39.4 |
| 1825 | -39.4 |
| 1826 | -39.4 |
| 1827 | -39.4 |
| 1828 | -39.4 |
| 1829 | -39.4 |
| 1830 | -39.4 |
| 1831 | -39.5 |
| 1832 | -39.5 |
| 1833 | -39.5 |
| 1834 | -39.5 |
| 1835 | -39.5 |
| 1836 | -39.5 |
| 1837 | -39.5 |
| 1838 | -39.5 |
| 1839 | -39.5 |
| 1840 | -39.5 |
| 1841 | -39.6 |
| 1842 | -39.6 |
| 1843 | -39.6 |
| 1844 | -39.6 |
| 1845 | -39.6 |
| 1846 | -39.7 |
| 1847 | -39.7 |
| 1848 | -39.7 |
| 1849 | -39.7 |
| 1850 | -39.7 |
| 1851 | -39.7 |
| 1852 | -39.7 |
| 1853 | -39.7 |
| 1854 | -39.7 |
| 1855 | -39.7 |
| 1856 | -39.8 |
| 1857 | -39.8 |
| 1858 | -39.8 |
| 1859 | -39.9 |
| 1860 | -39.9 |
| 1861 | -39.9 |
| 1862 | -39.9 |
| 1863 | -39.9 |
| 1864 | -39.9 |
| 1865 | -39.9 |
| 1866 | -40 |
| 1867 | -40 |
| 1868 | -40 |
| 1869 | -40 |
| 1870 | -40 |
| 1871 | -40 |
| 1872 | -40 |
| 1873 | -40 |
| 1874 | -40 |
| 1875 | -40 |
| 1876 | -40 |
| 1877 | -40 |
| 1878 | -40 |
| 1879 | -40.1 |
| 1880 | -40.1 |
| 1881 | -40.1 |
| 1882 | -40.1 |
| 1883 | -40.1 |
| 1884 | -40.1 |
| 1885 | -40.1 |
| 1886 | -40.1 |
| 1887 | -40.1 |
| 1888 | -40.1 |
| 1889 | -40.1 |
| 1890 | -40.1 |
| 1891 | -40.2 |
| 1892 | -40.2 |
| 1893 | -40.2 |
| 1894 | -40.2 |
| 1895 | -40.2 |
| 1896 | -40.2 |
| 1897 | -40.2 |
| 1898 | -40.2 |
| 1899 | -40.2 |
| 1900 | -40.3 |
| 1901 | -40.3 |
| 1902 | -40.3 |
| 1903 | -40.3 |
| 1904 | -40.3 |
| 1905 | -40.3 |
| 1906 | -40.3 |
| 1907 | -40.3 |
| 1908 | -40.3 |
| 1909 | -40.3 |
| 1910 | -40.3 |
| 1911 | -40.3 |
| 1912 | -40.4 |
| 1913 | -40.4 |
| 1914 | -40.4 |
| 1915 | -40.4 |
| 1916 | -40.4 |
| 1917 | -40.4 |
| 1918 | -40.4 |
| 1919 | -40.4 |
| 1920 | -40.5 |
| 1921 | -40.5 |
| 1922 | -40.5 |
| 1923 | -40.5 |
| 1924 | -40.5 |
| 1925 | -40.5 |
| 1926 | -40.6 |
| 1927 | -40.6 |
| 1928 | -40.6 |
| 1929 | -40.6 |
| 1930 | -40.6 |
| 1931 | -40.7 |
| 1932 | -40.7 |
| 1933 | -40.7 |
| 1934 | -40.7 |
| 1935 | -40.7 |
| 1936 | -40.7 |
| 1937 | -40.7 |
| 1938 | -40.7 |
| 1939 | -40.7 |
| 1940 | -40.7 |
| 1941 | -40.7 |
| 1942 | -40.7 |
| 1943 | -40.7 |
| 1944 | -40.7 |
| 1945 | -40.7 |
| 1946 | -40.8 |
| 1947 | -40.8 |
| 1948 | -40.8 |
| 1949 | -40.8 |
| 1950 | -40.8 |
| 1951 | -40.8 |
| 1952 | -40.8 |
| 1953 | -40.8 |
| 1954 | -40.9 |
| 1955 | -40.9 |
| 1956 | -40.9 |
| 1957 | -40.9 |
| 1958 | -40.9 |
| 1959 | -40.9 |
| 1960 | -40.9 |
| 1961 | -40.9 |
| 1962 | -40.9 |
| 1963 | -40.9 |
| 1964 | -40.9 |
| 1965 | -40.9 |
| 1966 | -40.9 |
| 1967 | -40.9 |
| 1968 | -40.9 |
| 1969 | -40.9 |
| 1970 | -40.9 |
| 1971 | -40.9 |
| 1972 | -41 |
| 1973 | -41 |
| 1974 | -41 |
| 1975 | -41 |
| 1976 | -41 |
| 1977 | -41 |
| 1978 | -41 |
| 1979 | -41.1 |
| 1980 | -41.1 |
| 1981 | -41.1 |
| 1982 | -41.1 |
| 1983 | -41.1 |
| 1984 | -41.1 |
| 1985 | -41.1 |
| 1986 | -41.1 |
| 1987 | -41.1 |
| 1988 | -41.2 |
| 1989 | -41.2 |
| 1990 | -41.2 |
| 1991 | -41.2 |
| 1992 | -41.2 |
| 1993 | -41.2 |
| 1994 | -41.2 |
| 1995 | -41.2 |
| 1996 | -41.2 |
| 1997 | -41.2 |
| 1998 | -41.3 |
| 1999 | -41.3 |
| 2000 | -41.3 |
| 2001 | -41.3 |
| 2002 | -41.3 |
| 2003 | -41.3 |
| 2004 | -41.3 |
| 2005 | -41.3 |
| 2006 | -41.4 |
| 2007 | -41.4 |
| 2008 | -41.4 |
| 2009 | -41.4 |
| 2010 | -41.4 |
| 2011 | -41.5 |
| 2012 | -41.5 |
| 2013 | -41.5 |
| 2014 | -41.5 |
| 2015 | -41.5 |
| 2016 | -41.5 |
| 2017 | -41.5 |
| 2018 | -41.5 |
| 2019 | -41.6 |
| 2020 | -41.6 |
| 2021 | -41.6 |
| 2022 | -41.6 |
| 2023 | -41.6 |
| 2024 | -41.6 |
| 2025 | -41.6 |
| 2026 | -41.6 |
| 2027 | -41.6 |
| 2028 | -41.6 |
| 2029 | -41.7 |
| 2030 | -41.7 |
| 2031 | -41.7 |
| 2032 | -41.7 |
| 2033 | -41.7 |
| 2034 | -41.8 |
| 2035 | -41.8 |
| 2036 | -41.8 |
| 2037 | -41.8 |
| 2038 | -41.8 |
| 2039 | -41.8 |
| 2040 | -41.9 |
| 2041 | -41.9 |
| 2042 | -41.9 |
| 2043 | -41.9 |
| 2044 | -41.9 |
| 2045 | -41.9 |
| 2046 | -41.9 |
| 2047 | -41.9 |
| 2048 | -41.9 |
| 2049 | -41.9 |
| 2050 | -41.9 |
| 2051 | -41.9 |
| 2052 | -42 |
| 2053 | -42 |
| 2054 | -42 |
| 2055 | -42 |
| 2056 | -42 |
| 2057 | -42 |
| 2058 | -42 |
| 2059 | -42 |
| 2060 | -42 |
| 2061 | -42 |
| 2062 | -42 |
| 2063 | -42.1 |
| 2064 | -42.1 |
| 2065 | -42.1 |
| 2066 | -42.1 |
| 2067 | -42.1 |
| 2068 | -42.2 |
| 2069 | -42.2 |
| 2070 | -42.2 |
| 2071 | -42.2 |
| 2072 | -42.2 |
| 2073 | -42.2 |
| 2074 | -42.3 |
| 2075 | -42.3 |
| 2076 | -42.3 |
| 2077 | -42.3 |
| 2078 | -42.3 |
| 2079 | -42.3 |
| 2080 | -42.3 |
| 2081 | -42.3 |
| 2082 | -42.3 |
| 2083 | -42.3 |
| 2084 | -42.3 |
| 2085 | -42.3 |
| 2086 | -42.3 |
| 2087 | -42.3 |
| 2088 | -42.4 |
| 2089 | -42.4 |
| 2090 | -42.4 |
| 2091 | -42.4 |
| 2092 | -42.4 |
| 2093 | -42.4 |
| 2094 | -42.4 |
| 2095 | -42.4 |
| 2096 | -42.4 |
| 2097 | -42.4 |
| 2098 | -42.4 |
| 2099 | -42.5 |
| 2100 | -42.5 |
| 2101 | -42.5 |
| 2102 | -42.5 |
| 2103 | -42.5 |
| 2104 | -42.5 |
| 2105 | -42.6 |
| 2106 | -42.6 |
| 2107 | -42.6 |
| 2108 | -42.6 |
| 2109 | -42.7 |
| 2110 | -42.7 |
| 2111 | -42.7 |
| 2112 | -42.7 |
| 2113 | -42.7 |
| 2114 | -42.7 |
| 2115 | -42.7 |
| 2116 | -42.7 |
| 2117 | -42.7 |
| 2118 | -42.7 |
| 2119 | -42.7 |
| 2120 | -42.8 |
| 2121 | -42.8 |
| 2122 | -42.8 |
| 2123 | -42.8 |
| 2124 | -42.8 |
| 2125 | -42.8 |
| 2126 | -42.8 |
| 2127 | -42.8 |
| 2128 | -42.8 |
| 2129 | -42.8 |
| 2130 | -42.8 |
| 2131 | -42.8 |
| 2132 | -42.8 |
| 2133 | -42.8 |
| 2134 | -42.8 |
| 2135 | -42.9 |
| 2136 | -42.9 |
| 2137 | -42.9 |
| 2138 | -42.9 |
| 2139 | -42.9 |
| 2140 | -42.9 |
| 2141 | -42.9 |
| 2142 | -42.9 |
| 2143 | -42.9 |
| 2144 | -42.9 |
| 2145 | -43 |
| 2146 | -43 |
| 2147 | -43 |
| 2148 | -43 |
| 2149 | -43 |
| 2150 | -43.1 |
| 2151 | -43.1 |
| 2152 | -43.1 |
| 2153 | -43.1 |
| 2154 | -43.1 |
| 2155 | -43.1 |
| 2156 | -43.1 |
| 2157 | -43.1 |
| 2158 | -43.1 |
| 2159 | -43.1 |
| 2160 | -43.2 |
| 2161 | -43.2 |
| 2162 | -43.2 |
| 2163 | -43.2 |
| 2164 | -43.2 |
| 2165 | -43.3 |
| 2166 | -43.3 |
| 2167 | -43.3 |
| 2168 | -43.3 |
| 2169 | -43.3 |
| 2170 | -43.3 |
| 2171 | -43.3 |
| 2172 | -43.3 |
| 2173 | -43.4 |
| 2174 | -43.4 |
| 2175 | -43.4 |
| 2176 | -43.4 |
| 2177 | -43.4 |
| 2178 | -43.4 |
| 2179 | -43.4 |
| 2180 | -43.5 |
| 2181 | -43.5 |
| 2182 | -43.5 |
| 2183 | -43.5 |
| 2184 | -43.5 |
| 2185 | -43.5 |
| 2186 | -43.5 |
| 2187 | -43.5 |
| 2188 | -43.5 |
| 2189 | -43.5 |
| 2190 | -43.5 |
| 2191 | -43.5 |
| 2192 | -43.6 |
| 2193 | -43.6 |
| 2194 | -43.6 |
| 2195 | -43.6 |
| 2196 | -43.6 |
| 2197 | -43.6 |
| 2198 | -43.6 |
| 2199 | -43.6 |
| 2200 | -43.6 |
| 2201 | -43.6 |
| 2202 | -43.7 |
| 2203 | -43.7 |
| 2204 | -43.7 |
| 2205 | -43.7 |
| 2206 | -43.7 |
| 2207 | -43.7 |
| 2208 | -43.7 |
| 2209 | -43.7 |
| 2210 | -43.7 |
| 2211 | -43.7 |
| 2212 | -43.8 |
| 2213 | -43.8 |
| 2214 | -43.8 |
| 2215 | -43.8 |
| 2216 | -43.8 |
| 2217 | -43.8 |
| 2218 | -43.8 |
| 2219 | -43.8 |
| 2220 | -43.8 |
| 2221 | -43.8 |
| 2222 | -43.8 |
| 2223 | -43.9 |
| 2224 | -43.9 |
| 2225 | -43.9 |
| 2226 | -43.9 |
| 2227 | -43.9 |
| 2228 | -43.9 |
| 2229 | -43.9 |
| 2230 | -43.9 |
| 2231 | -43.9 |
| 2232 | -43.9 |
| 2233 | -44 |
| 2234 | -44 |
| 2235 | -44 |
| 2236 | -44 |
| 2237 | -44.1 |
| 2238 | -44.1 |
| 2239 | -44.1 |
| 2240 | -44.1 |
| 2241 | -44.1 |
| 2242 | -44.1 |
| 2243 | -44.1 |
| 2244 | -44.1 |
| 2245 | -44.2 |
| 2246 | -44.2 |
| 2247 | -44.2 |
| 2248 | -44.2 |
| 2249 | -44.2 |
| 2250 | -44.2 |
| 2251 | -44.2 |
| 2252 | -44.2 |
| 2253 | -44.2 |
| 2254 | -44.2 |
| 2255 | -44.2 |
| 2256 | -44.2 |
| 2257 | -44.2 |
| 2258 | -44.2 |
| 2259 | -44.3 |
| 2260 | -44.3 |
| 2261 | -44.3 |
| 2262 | -44.3 |
| 2263 | -44.3 |
| 2264 | -44.3 |
| 2265 | -44.3 |
| 2266 | -44.3 |
| 2267 | -44.3 |
| 2268 | -44.3 |
| 2269 | -44.3 |
| 2270 | -44.3 |
| 2271 | -44.3 |
| 2272 | -44.3 |
| 2273 | -44.3 |
| 2274 | -44.4 |
| 2275 | -44.4 |
| 2276 | -44.4 |
| 2277 | -44.4 |
| 2278 | -44.4 |
| 2279 | -44.4 |
| 2280 | -44.4 |
| 2281 | -44.4 |
| 2282 | -44.4 |
| 2283 | -44.5 |
| 2284 | -44.5 |
| 2285 | -44.5 |
| 2286 | -44.5 |
| 2287 | -44.5 |
| 2288 | -44.5 |
| 2289 | -44.5 |
| 2290 | -44.5 |
| 2291 | -44.5 |
| 2292 | -44.5 |
| 2293 | -44.5 |
| 2294 | -44.5 |
| 2295 | -44.5 |
| 2296 | -44.5 |
| 2297 | -44.5 |
| 2298 | -44.5 |
| 2299 | -44.5 |
| 2300 | -44.5 |
| 2301 | -44.5 |
| 2302 | -44.5 |
| 2303 | -44.6 |
| 2304 | -44.6 |
| 2305 | -44.6 |
| 2306 | -44.6 |
| 2307 | -44.6 |
| 2308 | -44.6 |
| 2309 | -44.6 |
| 2310 | -44.6 |
| 2311 | -44.6 |
| 2312 | -44.6 |
| 2313 | -44.6 |
| 2314 | -44.6 |
| 2315 | -44.7 |
| 2316 | -44.7 |
| 2317 | -44.7 |
| 2318 | -44.7 |
| 2319 | -44.7 |
| 2320 | -44.8 |
| 2321 | -44.8 |
| 2322 | -44.8 |
| 2323 | -44.8 |
| 2324 | -44.8 |
| 2325 | -44.8 |
| 2326 | -44.8 |
| 2327 | -44.8 |
| 2328 | -44.8 |
| 2329 | -44.8 |
| 2330 | -44.8 |
| 2331 | -44.8 |
| 2332 | -44.8 |
| 2333 | -44.8 |
| 2334 | -44.9 |
| 2335 | -44.9 |
| 2336 | -44.9 |
| 2337 | -44.9 |
| 2338 | -44.9 |
| 2339 | -44.9 |
| 2340 | -44.9 |
| 2341 | -44.9 |
| 2342 | -44.9 |
| 2343 | -44.9 |
| 2344 | -44.9 |
| 2345 | -45 |
| 2346 | -45 |
| 2347 | -45 |
| 2348 | -45 |
| 2349 | -45 |
| 2350 | -45 |
| 2351 | -45 |
| 2352 | -45 |
| 2353 | -45 |
| 2354 | -45 |
| 2355 | -45 |
| 2356 | -45 |
| 2357 | -45 |
| 2358 | -45 |
| 2359 | -45 |
| 2360 | -45 |
| 2361 | -45.1 |
| 2362 | -45.1 |
| 2363 | -45.1 |
| 2364 | -45.1 |
| 2365 | -45.1 |
| 2366 | -45.1 |
| 2367 | -45.1 |
| 2368 | -45.1 |
| 2369 | -45.1 |
| 2370 | -45.2 |
| 2371 | -45.2 |
| 2372 | -45.2 |
| 2373 | -45.2 |
| 2374 | -45.2 |
| 2375 | -45.2 |
| 2376 | -45.2 |
| 2377 | -45.2 |
| 2378 | -45.2 |
| 2379 | -45.3 |
| 2380 | -45.3 |
| 2381 | -45.3 |
| 2382 | -45.3 |
| 2383 | -45.3 |
| 2384 | -45.3 |
| 2385 | -45.3 |
| 2386 | -45.3 |
| 2387 | -45.3 |
| 2388 | -45.3 |
| 2389 | -45.4 |
| 2390 | -45.4 |
| 2391 | -45.4 |
| 2392 | -45.4 |
| 2393 | -45.4 |
| 2394 | -45.4 |
| 2395 | -45.4 |
| 2396 | -45.4 |
| 2397 | -45.4 |
| 2398 | -45.4 |
| 2399 | -45.4 |
| 2400 | -45.4 |
| 2401 | -45.5 |
| 2402 | -45.5 |
| 2403 | -45.5 |
| 2404 | -45.5 |
| 2405 | -45.5 |
| 2406 | -45.5 |
| 2407 | -45.5 |
| 2408 | -45.5 |
| 2409 | -45.5 |
| 2410 | -45.5 |
| 2411 | -45.5 |
| 2412 | -45.5 |
| 2413 | -45.5 |
| 2414 | -45.5 |
| 2415 | -45.6 |
| 2416 | -45.6 |
| 2417 | -45.6 |
| 2418 | -45.6 |
| 2419 | -45.6 |
| 2420 | -45.6 |
| 2421 | -45.6 |
| 2422 | -45.6 |
| 2423 | -45.6 |
| 2424 | -45.6 |
| 2425 | -45.6 |
| 2426 | -45.6 |
| 2427 | -45.6 |
| 2428 | -45.6 |
| 2429 | -45.6 |
| 2430 | -45.6 |
| 2431 | -45.6 |
| 2432 | -45.7 |
| 2433 | -45.7 |
| 2434 | -45.7 |
| 2435 | -45.7 |
| 2436 | -45.7 |
| 2437 | -45.7 |
| 2438 | -45.7 |
| 2439 | -45.7 |
| 2440 | -45.7 |
| 2441 | -45.8 |
| 2442 | -45.8 |
| 2443 | -45.8 |
| 2444 | -45.8 |
| 2445 | -45.8 |
| 2446 | -45.8 |
| 2447 | -45.8 |
| 2448 | -45.8 |
| 2449 | -45.8 |
| 2450 | -45.8 |
| 2451 | -45.8 |
| 2452 | -45.8 |
| 2453 | -45.8 |
| 2454 | -45.8 |
| 2455 | -45.8 |
| 2456 | -45.8 |
| 2457 | -45.8 |
| 2458 | -45.8 |
| 2459 | -45.9 |
| 2460 | -45.9 |
| 2461 | -45.9 |
| 2462 | -45.9 |
| 2463 | -45.9 |
| 2464 | -45.9 |
| 2465 | -45.9 |
| 2466 | -45.9 |
| 2467 | -45.9 |
| 2468 | -45.9 |
| 2469 | -45.9 |
| 2470 | -45.9 |
| 2471 | -45.9 |
| 2472 | -46 |
| 2473 | -46 |
| 2474 | -46 |
| 2475 | -46 |
| 2476 | -46 |
| 2477 | -46 |
| 2478 | -46 |
| 2479 | -46 |
| 2480 | -46 |
| 2481 | -46 |
| 2482 | -46 |
| 2483 | -46 |
| 2484 | -46 |
| 2485 | -46 |
| 2486 | -46 |
| 2487 | -46 |
| 2488 | -46 |
| 2489 | -46.1 |
| 2490 | -46.1 |
| 2491 | -46.1 |
| 2492 | -46.1 |
| 2493 | -46.1 |
| 2494 | -46.1 |
| 2495 | -46.1 |
| 2496 | -46.1 |
| 2497 | -46.1 |
| 2498 | -46.1 |
| 2499 | -46.2 |
| 2500 | -46.2 |
| 2501 | -46.2 |
| 2502 | -46.2 |
| 2503 | -46.2 |
| 2504 | -46.2 |
| 2505 | -46.2 |
| 2506 | -46.2 |
| 2507 | -46.2 |
| 2508 | -46.2 |
| 2509 | -46.2 |
| 2510 | -46.3 |
| 2511 | -46.3 |
| 2512 | -46.3 |
| 2513 | -46.3 |
| 2514 | -46.3 |
| 2515 | -46.3 |
| 2516 | -46.3 |
| 2517 | -46.3 |
| 2518 | -46.3 |
| 2519 | -46.3 |
| 2520 | -46.3 |
| 2521 | -46.3 |
| 2522 | -46.3 |
| 2523 | -46.3 |
| 2524 | -46.3 |
| 2525 | -46.4 |
| 2526 | -46.4 |
| 2527 | -46.4 |
| 2528 | -46.4 |
| 2529 | -46.4 |
| 2530 | -46.4 |
| 2531 | -46.4 |
| 2532 | -46.4 |
| 2533 | -46.4 |
| 2534 | -46.4 |
| 2535 | -46.4 |
| 2536 | -46.4 |
| 2537 | -46.5 |
| 2538 | -46.5 |
| 2539 | -46.5 |
| 2540 | -46.5 |
| 2541 | -46.5 |
| 2542 | -46.5 |
| 2543 | -46.5 |
| 2544 | -46.5 |
| 2545 | -46.5 |
| 2546 | -46.5 |
| 2547 | -46.5 |
| 2548 | -46.5 |
| 2549 | -46.5 |
| 2550 | -46.5 |
| 2551 | -46.5 |
| 2552 | -46.5 |
| 2553 | -46.5 |
| 2554 | -46.5 |
| 2555 | -46.5 |
| 2556 | -46.5 |
| 2557 | -46.5 |
| 2558 | -46.5 |
| 2559 | -46.5 |
| 2560 | -46.5 |
| 2561 | -46.5 |
| 2562 | -46.6 |
| 2563 | -46.6 |
| 2564 | -46.6 |
| 2565 | -46.6 |
| 2566 | -46.6 |
| 2567 | -46.6 |
| 2568 | -46.6 |
| 2569 | -46.6 |
| 2570 | -46.6 |
| 2571 | -46.6 |
| 2572 | -46.6 |
| 2573 | -46.6 |
| 2574 | -46.6 |
| 2575 | -46.6 |
| 2576 | -46.6 |
| 2577 | -46.6 |
| 2578 | -46.6 |
| 2579 | -46.6 |
| 2580 | -46.6 |
| 2581 | -46.7 |
| 2582 | -46.7 |
| 2583 | -46.7 |
| 2584 | -46.7 |
| 2585 | -46.7 |
| 2586 | -46.7 |
| 2587 | -46.7 |
| 2588 | -46.7 |
| 2589 | -46.8 |
| 2590 | -46.8 |
| 2591 | -46.8 |
| 2592 | -46.8 |
| 2593 | -46.9 |
| 2594 | -46.9 |
| 2595 | -46.9 |
| 2596 | -46.9 |
| 2597 | -46.9 |
| 2598 | -46.9 |
| 2599 | -46.9 |
| 2600 | -46.9 |
| 2601 | -46.9 |
| 2602 | -46.9 |
| 2603 | -46.9 |
| 2604 | -47 |
| 2605 | -47 |
| 2606 | -47 |
| 2607 | -47 |
| 2608 | -47 |
| 2609 | -47 |
| 2610 | -47 |
| 2611 | -47 |
| 2612 | -47 |
| 2613 | -47 |
| 2614 | -47 |
| 2615 | -47 |
| 2616 | -47 |
| 2617 | -47.1 |
| 2618 | -47.1 |
| 2619 | -47.1 |
| 2620 | -47.1 |
| 2621 | -47.1 |
| 2622 | -47.1 |
| 2623 | -47.1 |
| 2624 | -47.1 |
| 2625 | -47.1 |
| 2626 | -47.1 |
| 2627 | -47.1 |
| 2628 | -47.1 |
| 2629 | -47.1 |
| 2630 | -47.2 |
| 2631 | -47.2 |
| 2632 | -47.2 |
| 2633 | -47.2 |
| 2634 | -47.2 |
| 2635 | -47.2 |
| 2636 | -47.2 |
| 2637 | -47.2 |
| 2638 | -47.2 |
| 2639 | -47.2 |
| 2640 | -47.2 |
| 2641 | -47.2 |
| 2642 | -47.2 |
| 2643 | -47.2 |
| 2644 | -47.2 |
| 2645 | -47.2 |
| 2646 | -47.2 |
| 2647 | -47.2 |
| 2648 | -47.2 |
| 2649 | -47.2 |
| 2650 | -47.2 |
| 2651 | -47.3 |
| 2652 | -47.3 |
| 2653 | -47.3 |
| 2654 | -47.3 |
| 2655 | -47.3 |
| 2656 | -47.3 |
| 2657 | -47.3 |
| 2658 | -47.3 |
| 2659 | -47.3 |